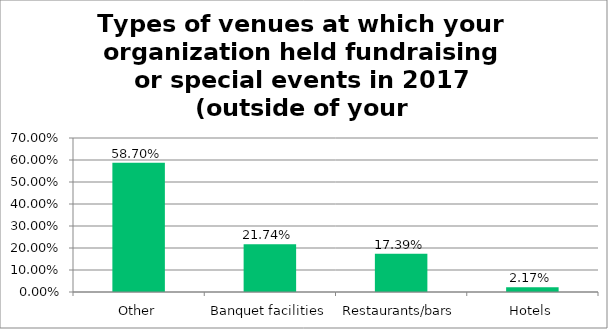
| Category | Responses |
|---|---|
| Other | 0.587 |
| Banquet facilities | 0.217 |
| Restaurants/bars | 0.174 |
| Hotels | 0.022 |